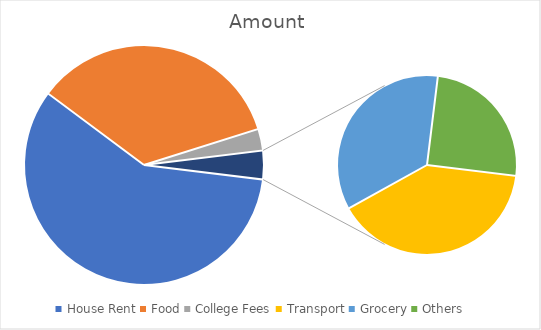
| Category | Amount |
|---|---|
| House Rent | 3000 |
| Food | 1800 |
| College Fees | 150 |
| Transport | 80 |
| Grocery | 70 |
| Others | 50 |